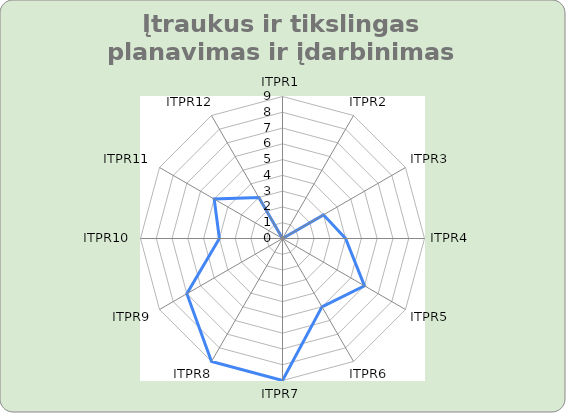
| Category | Series 0 |
|---|---|
| ITPR1 | 0 |
| ITPR2 | 0 |
| ITPR3 | 3 |
| ITPR4 | 4 |
| ITPR5 | 6 |
| ITPR6 | 5 |
| ITPR7 | 9 |
| ITPR8 | 9 |
| ITPR9 | 7 |
| ITPR10 | 4 |
| ITPR11 | 5 |
| ITPR12 | 3 |